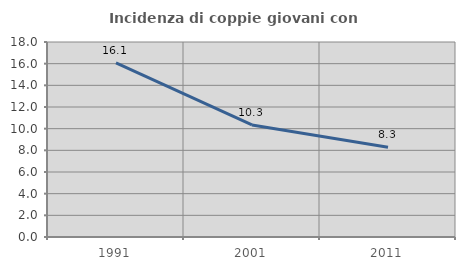
| Category | Incidenza di coppie giovani con figli |
|---|---|
| 1991.0 | 16.076 |
| 2001.0 | 10.345 |
| 2011.0 | 8.278 |